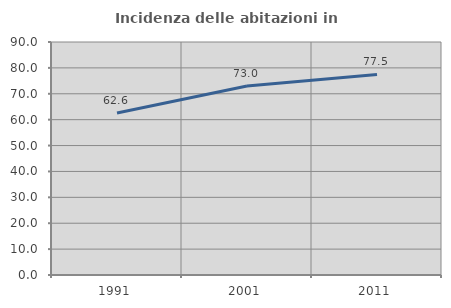
| Category | Incidenza delle abitazioni in proprietà  |
|---|---|
| 1991.0 | 62.558 |
| 2001.0 | 72.969 |
| 2011.0 | 77.474 |